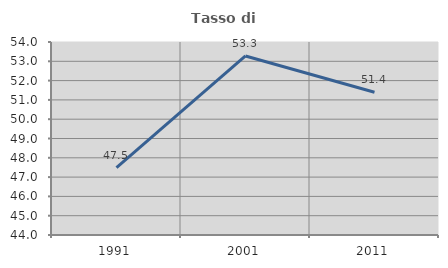
| Category | Tasso di occupazione   |
|---|---|
| 1991.0 | 47.487 |
| 2001.0 | 53.276 |
| 2011.0 | 51.4 |